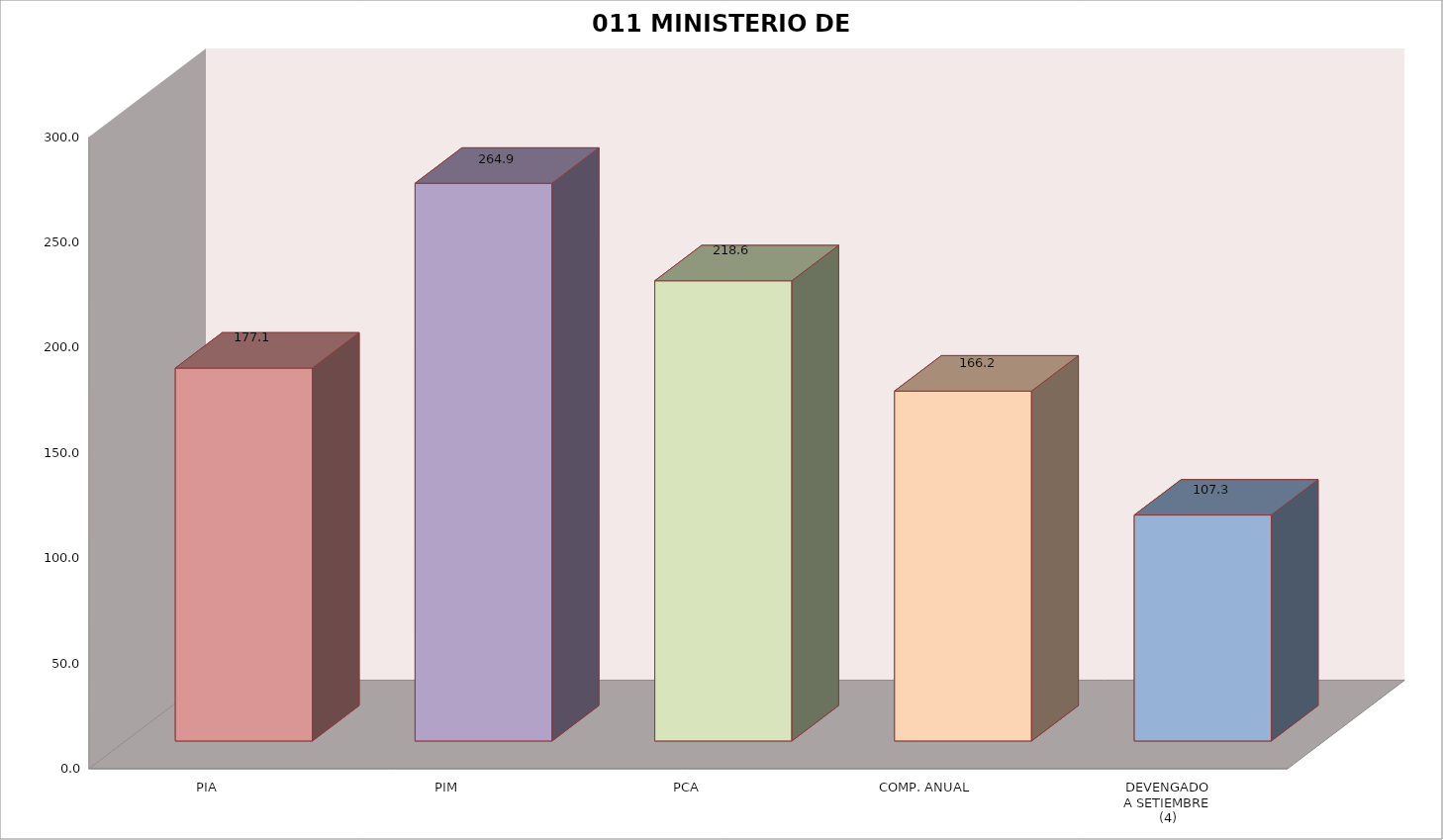
| Category | 011 MINISTERIO DE SALUD |
|---|---|
| PIA | 177.09 |
| PIM | 264.874 |
| PCA | 218.563 |
| COMP. ANUAL | 166.192 |
| DEVENGADO
A SETIEMBRE
(4) | 107.301 |